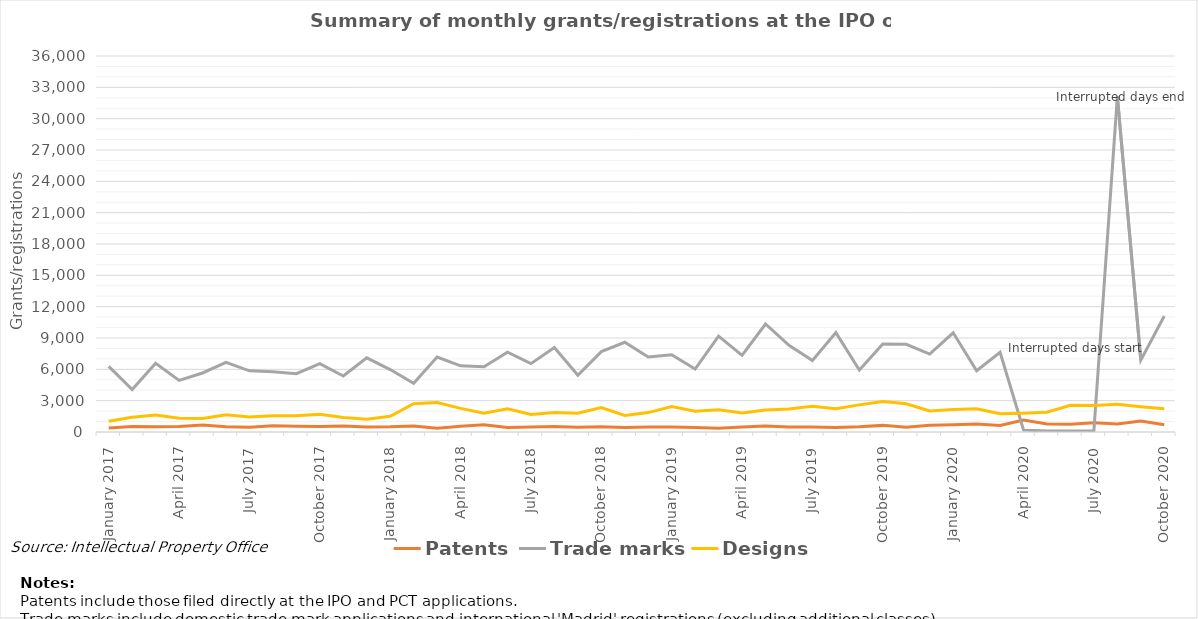
| Category | Patents | Trade marks | Designs |
|---|---|---|---|
| January 2017 | 387 | 6287 | 1026 |
| February 2017 | 533 | 4063 | 1420 |
| March 2017 | 505 | 6576 | 1631 |
| April 2017 | 516 | 4937 | 1318 |
| May 2017 | 681 | 5651 | 1284 |
| June 2017 | 495 | 6658 | 1660 |
| July 2017 | 466 | 5857 | 1437 |
| August 2017 | 592 | 5763 | 1550 |
| September 2017 | 554 | 5578 | 1553 |
| October 2017 | 517 | 6538 | 1705 |
| November 2017 | 578 | 5362 | 1397 |
| December 2017 | 487 | 7101 | 1218 |
| January 2018 | 495 | 5977 | 1512 |
| February 2018 | 574 | 4670 | 2704 |
| March 2018 | 370 | 7176 | 2825 |
| April 2018 | 543 | 6332 | 2259 |
| May 2018 | 690 | 6251 | 1789 |
| June 2018 | 424 | 7636 | 2222 |
| July 2018 | 486 | 6546 | 1678 |
| August 2018 | 536 | 8099 | 1878 |
| September 2018 | 450 | 5426 | 1795 |
| October 2018 | 498 | 7698 | 2348 |
| November 2018 | 432 | 8590 | 1592 |
| December 2018 | 484 | 7188 | 1859 |
| January 2019 | 475 | 7393 | 2444 |
| February 2019 | 426 | 6021 | 1987 |
| March 2019 | 363 | 9184 | 2125 |
| April 2019 | 488 | 7333 | 1810 |
| May 2019 | 573 | 10342 | 2096 |
| June 2019 | 471 | 8301 | 2202 |
| July 2019 | 489 | 6839 | 2464 |
| August 2019 | 420 | 9513 | 2219 |
| September 2019 | 500 | 5942 | 2596 |
| October 2019 | 634 | 8434 | 2926 |
| November 2019 | 455 | 8397 | 2700 |
| December 2019 | 654 | 7464 | 2021 |
| January 2020 | 696 | 9501 | 2145 |
| February 2020 | 756 | 5867 | 2220 |
| March 2020 | 622 | 7622 | 1758 |
| April 2020 | 1143 | 190 | 1803 |
| May 2020 | 768 | 103 | 1888 |
| June 2020 | 740 | 101 | 2566 |
| July 2020 | 878 | 129 | 2539 |
| August 2020 | 771 | 32107 | 2666 |
| September 2020 | 1042 | 6880 | 2428 |
| October 2020 | 697 | 11104 | 2223 |